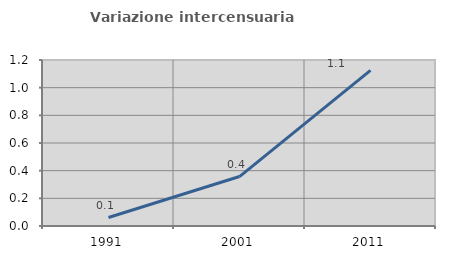
| Category | Variazione intercensuaria annua |
|---|---|
| 1991.0 | 0.061 |
| 2001.0 | 0.357 |
| 2011.0 | 1.125 |